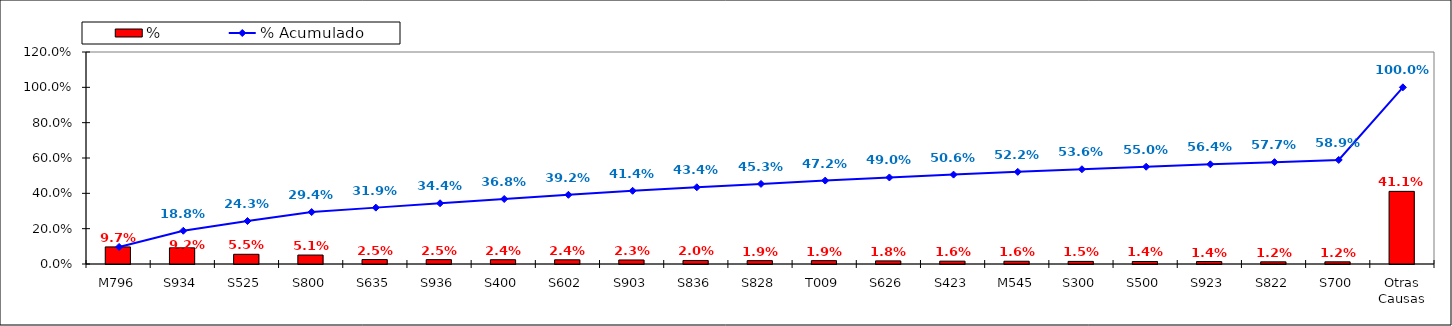
| Category | % |
|---|---|
| M796 | 0.097 |
| S934 | 0.092 |
| S525 | 0.055 |
| S800 | 0.051 |
| S635 | 0.025 |
| S936 | 0.025 |
| S400 | 0.024 |
| S602 | 0.024 |
| S903 | 0.023 |
| S836 | 0.02 |
| S828 | 0.019 |
| T009 | 0.019 |
| S626 | 0.018 |
| S423 | 0.016 |
| M545 | 0.016 |
| S300 | 0.015 |
| S500 | 0.014 |
| S923 | 0.014 |
| S822 | 0.012 |
| S700 | 0.012 |
| Otras Causas | 0.411 |